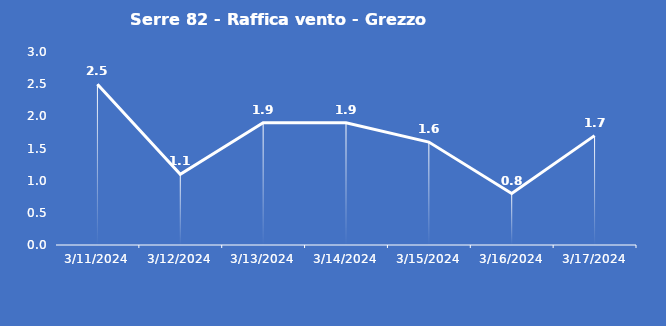
| Category | Serre 82 - Raffica vento - Grezzo (m/s) |
|---|---|
| 3/11/24 | 2.5 |
| 3/12/24 | 1.1 |
| 3/13/24 | 1.9 |
| 3/14/24 | 1.9 |
| 3/15/24 | 1.6 |
| 3/16/24 | 0.8 |
| 3/17/24 | 1.7 |